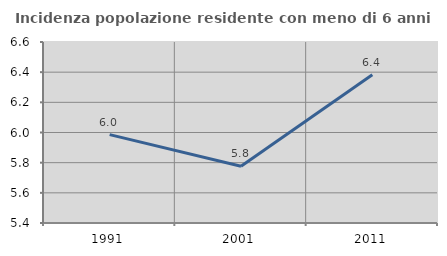
| Category | Incidenza popolazione residente con meno di 6 anni |
|---|---|
| 1991.0 | 5.986 |
| 2001.0 | 5.777 |
| 2011.0 | 6.382 |